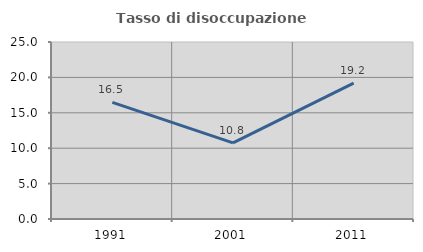
| Category | Tasso di disoccupazione giovanile  |
|---|---|
| 1991.0 | 16.467 |
| 2001.0 | 10.762 |
| 2011.0 | 19.178 |